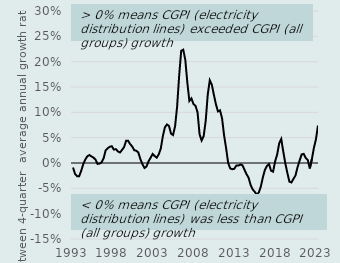
| Category | Difference |
|---|---|
| 1993 | -0.009 |
| 1994 | -0.022 |
| 1994 | -0.026 |
| 1994 | -0.026 |
| 1994 | -0.015 |
| 1995 | -0.002 |
| 1995 | 0.007 |
| 1995 | 0.013 |
| 1995 | 0.016 |
| 1996 | 0.013 |
| 1996 | 0.011 |
| 1996 | 0.007 |
| 1996 | -0.002 |
| 1997 | -0.001 |
| 1997 | 0.001 |
| 1997 | 0.009 |
| 1997 | 0.025 |
| 1998 | 0.029 |
| 1998 | 0.032 |
| 1998 | 0.033 |
| 1998 | 0.026 |
| 1999 | 0.027 |
| 1999 | 0.023 |
| 1999 | 0.021 |
| 1999 | 0.026 |
| 2000 | 0.031 |
| 2000 | 0.044 |
| 2000 | 0.044 |
| 2000 | 0.037 |
| 2001 | 0.033 |
| 2001 | 0.025 |
| 2001 | 0.024 |
| 2001 | 0.021 |
| 2002 | 0.008 |
| 2002 | -0.002 |
| 2002 | -0.01 |
| 2002 | -0.007 |
| 2003 | 0.003 |
| 2003 | 0.01 |
| 2003 | 0.018 |
| 2003 | 0.014 |
| 2004 | 0.011 |
| 2004 | 0.017 |
| 2004 | 0.029 |
| 2004 | 0.053 |
| 2005 | 0.07 |
| 2005 | 0.076 |
| 2005 | 0.073 |
| 2005 | 0.058 |
| 2006 | 0.055 |
| 2006 | 0.073 |
| 2006 | 0.112 |
| 2006 | 0.172 |
| 2007 | 0.221 |
| 2007 | 0.224 |
| 2007 | 0.204 |
| 2007 | 0.159 |
| 2008 | 0.122 |
| 2008 | 0.128 |
| 2008 | 0.116 |
| 2008 | 0.113 |
| 2009 | 0.1 |
| 2009 | 0.057 |
| 2009 | 0.044 |
| 2009 | 0.053 |
| 2010 | 0.083 |
| 2010 | 0.135 |
| 2010 | 0.163 |
| 2010 | 0.154 |
| 2011 | 0.135 |
| 2011 | 0.116 |
| 2011 | 0.102 |
| 2011 | 0.104 |
| 2012 | 0.089 |
| 2012 | 0.055 |
| 2012 | 0.029 |
| 2012 | 0 |
| 2013 | -0.011 |
| 2013 | -0.012 |
| 2013 | -0.011 |
| 2013 | -0.005 |
| 2014 | -0.005 |
| 2014 | -0.003 |
| 2014 | -0.004 |
| 2014 | -0.013 |
| 2015 | -0.022 |
| 2015 | -0.029 |
| 2015 | -0.043 |
| 2015 | -0.052 |
| 2016 | -0.057 |
| 2016 | -0.063 |
| 2016 | -0.058 |
| 2016 | -0.047 |
| 2017 | -0.028 |
| 2017 | -0.014 |
| 2017 | -0.006 |
| 2017 | -0.002 |
| 2018 | -0.015 |
| 2018 | -0.017 |
| 2018 | 0.003 |
| 2018 | 0.017 |
| 2019 | 0.039 |
| 2019 | 0.047 |
| 2019 | 0.023 |
| 2019 | -0.001 |
| 2020 | -0.02 |
| 2020 | -0.037 |
| 2020 | -0.038 |
| 2020 | -0.031 |
| 2021 | -0.025 |
| 2021 | -0.008 |
| 2021 | 0.005 |
| 2021 | 0.017 |
| 2022 | 0.018 |
| 2022 | 0.01 |
| 2022 | 0.006 |
| 2022 | -0.011 |
| 2023 | 0.007 |
| 2023 | 0.03 |
| 2023 | 0.047 |
| 2023 | 0.074 |